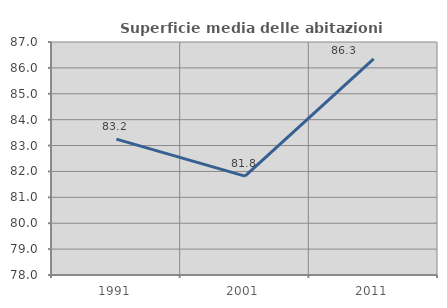
| Category | Superficie media delle abitazioni occupate |
|---|---|
| 1991.0 | 83.248 |
| 2001.0 | 81.818 |
| 2011.0 | 86.347 |